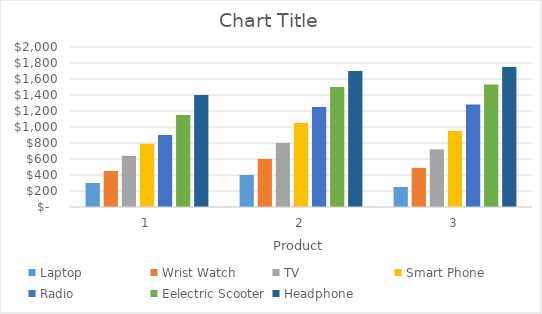
| Category | Laptop | Wrist Watch | TV | Smart Phone | Radio | Eelectric Scooter | Headphone |
|---|---|---|---|---|---|---|---|
| 0 | 300 | 450 | 640 | 790 | 900 | 1150 | 1400 |
| 1 | 400 | 600 | 800 | 1050 | 1250 | 1500 | 1700 |
| 2 | 250 | 490 | 720 | 950 | 1280 | 1530 | 1750 |